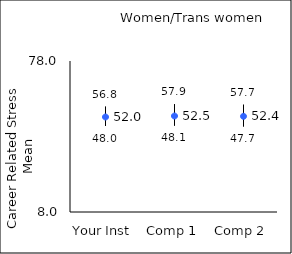
| Category | 25th percentile | 75th percentile | Mean |
|---|---|---|---|
| Your Inst | 48 | 56.8 | 52.04 |
| Comp 1 | 48.1 | 57.9 | 52.5 |
| Comp 2 | 47.7 | 57.7 | 52.36 |